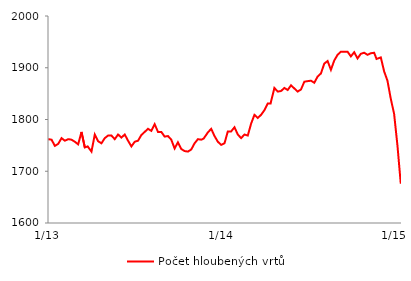
| Category | Počet hloubených vrtů |
|---|---|
| 2013-01-04 | 1762 |
| 2013-01-11 | 1761 |
| 2013-01-18 | 1749 |
| 2013-01-25 | 1753 |
| 2013-02-01 | 1764 |
| 2013-02-08 | 1759 |
| 2013-02-15 | 1762 |
| 2013-02-22 | 1761 |
| 2013-03-01 | 1757 |
| 2013-03-08 | 1752 |
| 2013-03-15 | 1776 |
| 2013-03-22 | 1746 |
| 2013-03-28 | 1748 |
| 2013-04-05 | 1738 |
| 2013-04-12 | 1771 |
| 2013-04-19 | 1758 |
| 2013-04-26 | 1754 |
| 2013-05-03 | 1764 |
| 2013-05-10 | 1769 |
| 2013-05-17 | 1769 |
| 2013-05-24 | 1762 |
| 2013-05-31 | 1771 |
| 2013-06-07 | 1765 |
| 2013-06-14 | 1771 |
| 2013-06-21 | 1759 |
| 2013-06-28 | 1748 |
| 2013-07-05 | 1757 |
| 2013-07-12 | 1759 |
| 2013-07-19 | 1770 |
| 2013-07-26 | 1776 |
| 2013-08-02 | 1782 |
| 2013-08-09 | 1778 |
| 2013-08-16 | 1791 |
| 2013-08-23 | 1776 |
| 2013-08-30 | 1776 |
| 2013-09-06 | 1767 |
| 2013-09-13 | 1768 |
| 2013-09-20 | 1761 |
| 2013-09-27 | 1744 |
| 2013-10-04 | 1756 |
| 2013-10-11 | 1743 |
| 2013-10-18 | 1739 |
| 2013-10-25 | 1738 |
| 2013-11-01 | 1742 |
| 2013-11-08 | 1754 |
| 2013-11-15 | 1762 |
| 2013-11-22 | 1761 |
| 2013-11-27 | 1763 |
| 2013-12-06 | 1775 |
| 2013-12-13 | 1782 |
| 2013-12-20 | 1768 |
| 2013-12-27 | 1757 |
| 2014-01-03 | 1751 |
| 2014-01-10 | 1754 |
| 2014-01-17 | 1777 |
| 2014-01-24 | 1777 |
| 2014-01-31 | 1785 |
| 2014-02-07 | 1771 |
| 2014-02-14 | 1764 |
| 2014-02-21 | 1771 |
| 2014-02-28 | 1769 |
| 2014-03-07 | 1792 |
| 2014-03-14 | 1809 |
| 2014-03-21 | 1803 |
| 2014-03-28 | 1809 |
| 2014-04-04 | 1818 |
| 2014-04-11 | 1831 |
| 2014-04-17 | 1831 |
| 2014-04-25 | 1861 |
| 2014-05-02 | 1854 |
| 2014-05-09 | 1855 |
| 2014-05-16 | 1861 |
| 2014-05-23 | 1857 |
| 2014-05-30 | 1866 |
| 2014-06-06 | 1860 |
| 2014-06-13 | 1854 |
| 2014-06-20 | 1858 |
| 2014-06-27 | 1873 |
| 2014-07-03 | 1874 |
| 2014-07-11 | 1875 |
| 2014-07-18 | 1871 |
| 2014-07-25 | 1883 |
| 2014-08-01 | 1889 |
| 2014-08-08 | 1908 |
| 2014-08-15 | 1913 |
| 2014-08-22 | 1896 |
| 2014-08-29 | 1914 |
| 2014-09-05 | 1925 |
| 2014-09-12 | 1931 |
| 2014-09-19 | 1931 |
| 2014-09-26 | 1931 |
| 2014-10-03 | 1922 |
| 2014-10-10 | 1930 |
| 2014-10-17 | 1918 |
| 2014-10-24 | 1927 |
| 2014-10-31 | 1929 |
| 2014-11-07 | 1925 |
| 2014-11-14 | 1928 |
| 2014-11-21 | 1929 |
| 2014-11-26 | 1917 |
| 2014-12-05 | 1920 |
| 2014-12-12 | 1893 |
| 2014-12-19 | 1875 |
| 2014-12-26 | 1840 |
| 2015-01-02 | 1811 |
| 2015-01-09 | 1750 |
| 2015-01-16 | 1676 |